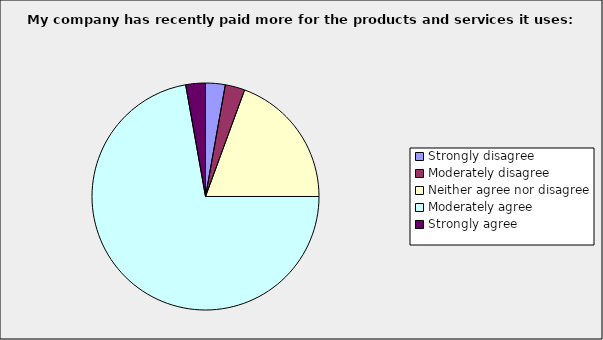
| Category | Series 0 |
|---|---|
| Strongly disagree | 0.028 |
| Moderately disagree | 0.028 |
| Neither agree nor disagree | 0.194 |
| Moderately agree | 0.722 |
| Strongly agree | 0.028 |